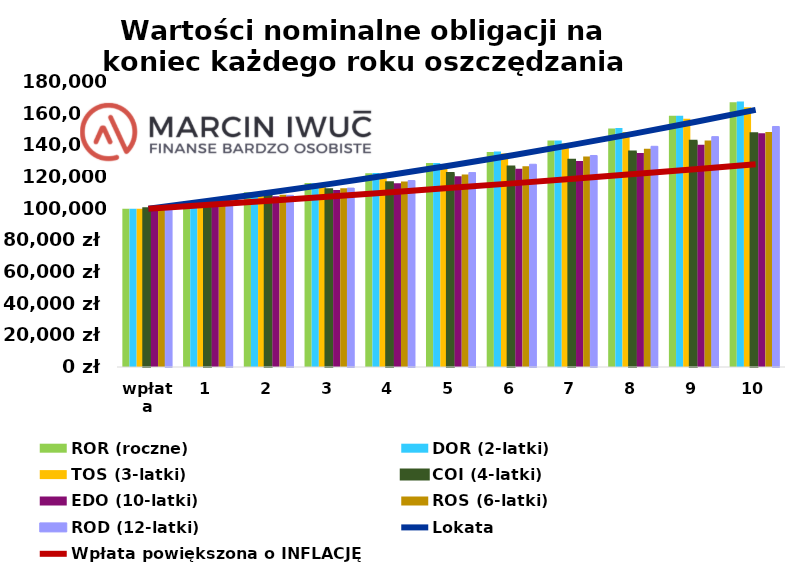
| Category | ROR (roczne) | DOR (2-latki) | TOS (3-latki) | COI (4-latki) | EDO (10-latki) | ROS (6-latki) | ROD (12-latki)  |
|---|---|---|---|---|---|---|---|
| wpłata | 100000 | 100000 | 100000 | 100000 | 100000 | 100000 | 100000 |
| koniec 1 roku | 104776.773 | 104489.089 | 104455 | 104738.5 | 103888 | 104900.5 | 104090.5 |
| koniec 2 roku | 110306.278 | 110359.923 | 109788.364 | 108242.169 | 107780.86 | 108791.537 | 108426.025 |
| koniec 3 roku | 116210.12 | 115994.249 | 116019.397 | 111919.961 | 111848.899 | 112857.672 | 112978.326 |
| koniec 4 roku | 122401.965 | 122511.44 | 121431.081 | 116347.53 | 116099.999 | 117106.782 | 117758.243 |
| koniec 5 roku | 128895.758 | 128813.473 | 127631.152 | 122186.004 | 120542.399 | 121547.102 | 122777.155 |
| koniec 6 roku | 135811.123 | 136050.461 | 134874.448 | 126274.31 | 125184.707 | 126754.237 | 128047.012 |
| koniec 7 roku | 143063.777 | 142979.346 | 141165.877 | 130565.793 | 130035.919 | 132965.866 | 133580.363 |
| koniec 8 roku | 150670.025 | 151012.55 | 148373.453 | 135731.673 | 135105.435 | 137898.639 | 139390.381 |
| koniec 9 roku | 158752.163 | 158738.975 | 156793.257 | 142542.794 | 140403.08 | 143053.401 | 145490.9 |
| koniec 10 roku | 167228.414 | 167657.768 | 164107.243 | 147312.676 | 147559.118 | 148440.142 | 151896.445 |